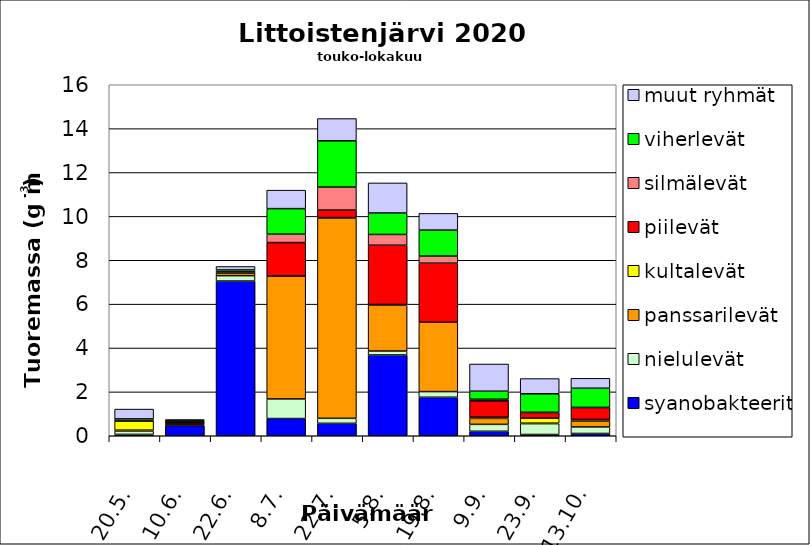
| Category | syanobakteerit | nielulevät | panssarilevät | kultalevät | piilevät | silmälevät | viherlevät | muut ryhmät |
|---|---|---|---|---|---|---|---|---|
| 20.5. | 0.062 | 0.155 | 0.038 | 0.414 | 0.025 | 0.006 | 0.068 | 0.446 |
| 10.6. | 0.465 | 0.055 | 0.025 | 0.039 | 0.061 | 0.009 | 0.028 | 0.059 |
| 22.6. | 7.052 | 0.245 | 0.121 | 0 | 0.052 | 0 | 0.089 | 0.156 |
| 8.7. | 0.785 | 0.894 | 5.605 | 0.004 | 1.519 | 0.384 | 1.163 | 0.842 |
| 22.7. | 0.567 | 0.229 | 9.131 | 0.019 | 0.342 | 1.049 | 2.109 | 1.014 |
| 5.8. | 3.683 | 0.18 | 2.086 | 0.034 | 2.703 | 0.49 | 0.979 | 1.371 |
| 19.8. | 1.756 | 0.257 | 3.165 | 0 | 2.69 | 0.325 | 1.183 | 0.761 |
| 9.9. | 0.205 | 0.315 | 0.271 | 0.06 | 0.741 | 0.074 | 0.366 | 1.238 |
| 23.9. | 0.058 | 0.494 | 0.021 | 0.231 | 0.255 | 0.01 | 0.844 | 0.693 |
| 13.10. | 0.105 | 0.299 | 0.263 | 0.077 | 0.546 | 0.004 | 0.873 | 0.451 |